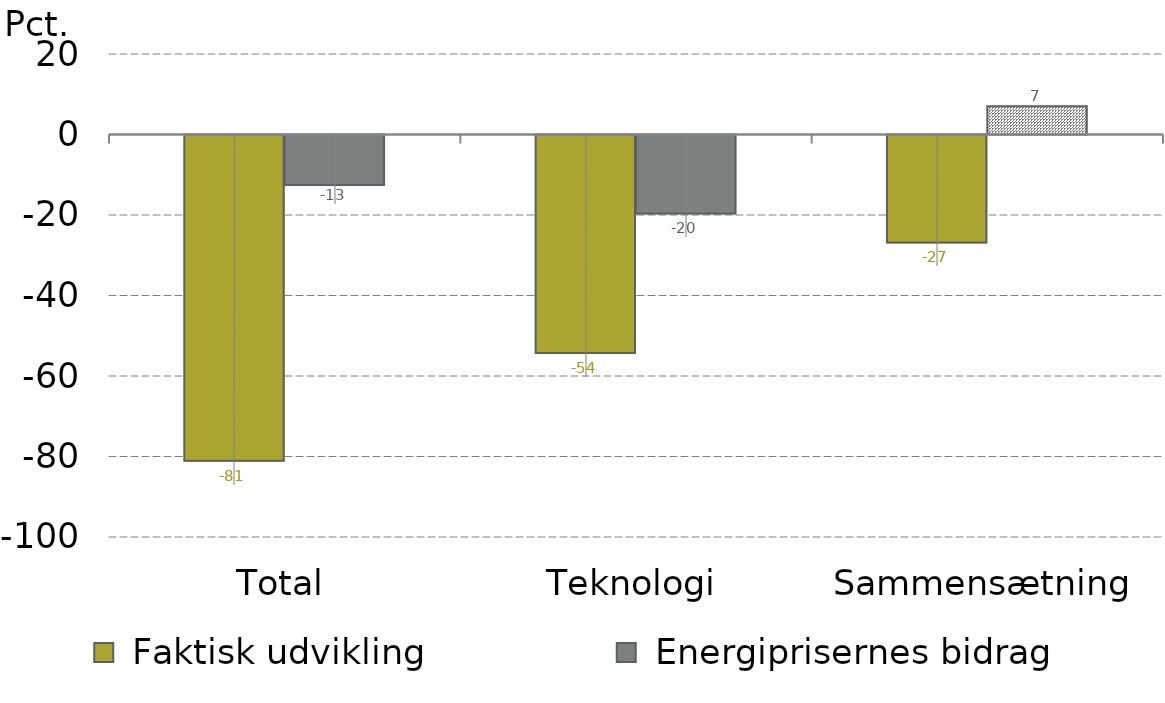
| Category |  Faktisk udvikling |  Energiprisernes bidrag |
|---|---|---|
| Total | -81.08 | -12.517 |
| Teknologi | -54.264 | -19.602 |
| Sammensætning | -26.816 | 7 |